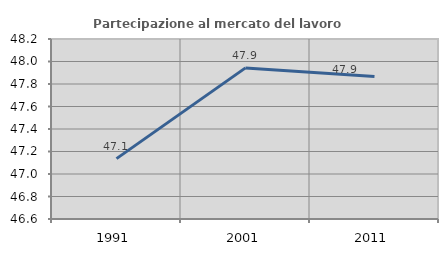
| Category | Partecipazione al mercato del lavoro  femminile |
|---|---|
| 1991.0 | 47.137 |
| 2001.0 | 47.943 |
| 2011.0 | 47.867 |